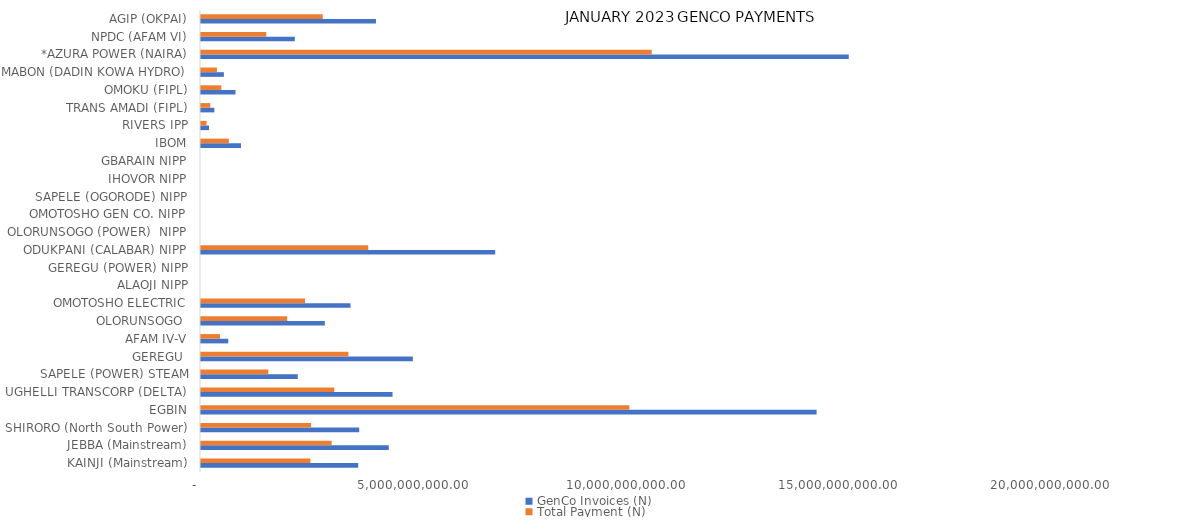
| Category | GenCo Invoices (N) | Total Payment (N) |
|---|---|---|
| KAINJI (Mainstream) | 3698391022.25 | 2573483456.874 |
| JEBBA (Mainstream) | 4417904667.17 | 3074148868.146 |
| SHIRORO (North South Power) | 3722320074.687 | 2590134216.681 |
| EGBIN | 14485059213.945 | 10079264208.318 |
| UGHELLI TRANSCORP (DELTA) | 4507093159.654 | 3136209669.334 |
| SAPELE (POWER) STEAM | 2277032474.211 | 1584447227.969 |
| GEREGU  | 4984768730.5 | 3468594798.957 |
| AFAM IV-V | 642117329.356 | 446810062.681 |
| OLORUNSOGO  | 2913577336.29 | 2027379752.481 |
| OMOTOSHO ELECTRIC | 3518648452.24 | 2448411627.629 |
| ALAOJI NIPP | 0 | 0 |
| GEREGU (POWER) NIPP | 0 | 0 |
| ODUKPANI (CALABAR) NIPP | 6921942740.11 | 3934804538.916 |
| OLORUNSOGO (POWER)  NIPP | 0 | 0 |
| OMOTOSHO GEN CO. NIPP | 0 | 0 |
| SAPELE (OGORODE) NIPP | 0 | 0 |
| IHOVOR NIPP | 0 | 0 |
| GBARAIN NIPP | 0 | 0 |
| IBOM | 940987236.5 | 654775298.689 |
| RIVERS IPP | 188428403.5 | 131115767.991 |
| TRANS AMADI (FIPL) | 313380720.055 | 218062420.634 |
| OMOKU (FIPL) | 811242416.574 | 478481201.289 |
| MABON (DADIN KOWA HYDRO) | 538261943.674 | 374543470.167 |
| *AZURA POWER (NAIRA) | 15241607249.258 | 10605699580.213 |
| NPDC (AFAM VI) | 2207084708.297 | 1535774868.193 |
| AGIP (OKPAI) | 4116899842.392 | 2864698073.91 |